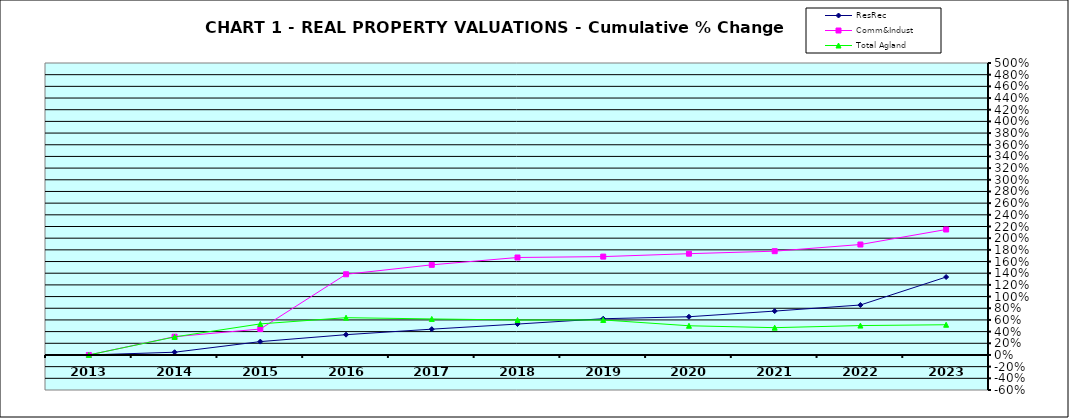
| Category | ResRec | Comm&Indust | Total Agland |
|---|---|---|---|
| 2013.0 | 0 | 0 | 0 |
| 2014.0 | 0.047 | 0.313 | 0.309 |
| 2015.0 | 0.229 | 0.444 | 0.532 |
| 2016.0 | 0.347 | 1.382 | 0.638 |
| 2017.0 | 0.442 | 1.543 | 0.617 |
| 2018.0 | 0.529 | 1.669 | 0.598 |
| 2019.0 | 0.62 | 1.685 | 0.599 |
| 2020.0 | 0.655 | 1.735 | 0.5 |
| 2021.0 | 0.751 | 1.777 | 0.468 |
| 2022.0 | 0.856 | 1.891 | 0.503 |
| 2023.0 | 1.335 | 2.148 | 0.518 |